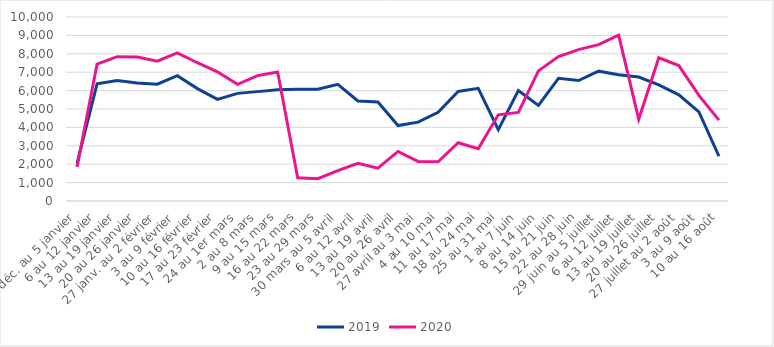
| Category | 2019 | 2020 |
|---|---|---|
| 30 déc. au 5 janvier | 2040 | 1844 |
| 6 au 12 janvier | 6370 | 7444 |
| 13 au 19 janvier | 6554 | 7846 |
| 20 au 26 janvier | 6407 | 7831 |
| 27 janv. au 2 février | 6351 | 7599 |
| 3 au 9 février | 6808 | 8055 |
| 10 au 16 février | 6108 | 7514 |
| 17 au 23 février | 5521 | 7024 |
| 24 au 1er mars | 5849 | 6340 |
| 2 au 8 mars | 5944 | 6815 |
| 9 au 15 mars | 6046 | 7006 |
| 16 au 22 mars | 6069 | 1259 |
| 23 au 29 mars | 6072 | 1214 |
| 30 mars au 5 avril | 6339 | 1653 |
| 6 au 12 avril | 5437 | 2049 |
| 13 au 19 avril | 5376 | 1786 |
| 20 au 26 avril | 4100 | 2693 |
| 27 avril au 3 mai | 4284 | 2153 |
| 4 au 10 mai | 4818 | 2134 |
| 11 au 17 mai | 5953 | 3169 |
| 18 au 24 mai | 6120 | 2841 |
| 25 au 31 mai | 3877 | 4682 |
| 1 au 7 juin | 5999 | 4816 |
| 8 au 14 juin | 5197 | 7071 |
| 15 au 21 juin | 6668 | 7848 |
| 22 au 28 juin | 6548 | 8225 |
| 29 juin au 5 juillet | 7057 | 8496 |
| 6 au 12 juillet | 6862 | 9019 |
| 13 au 19 juillet | 6737 | 4443 |
| 20 au 26 juillet | 6309 | 7782 |
| 27 juillet au 2 août | 5772 | 7359 |
| 3 au 9 août | 4840 | 5739 |
| 10 au 16 août | 2432 | 4397 |